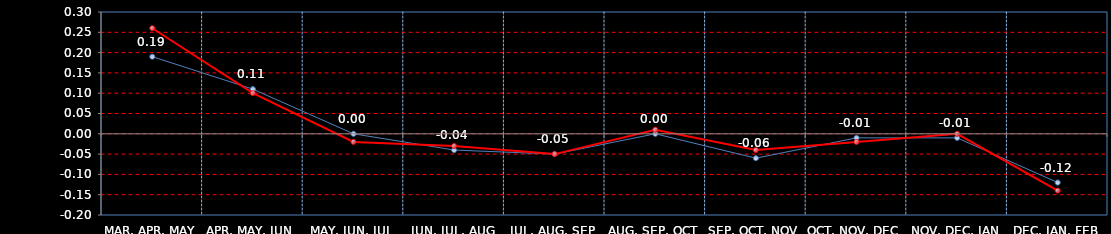
| Category | Last | Settlement |
|---|---|---|
| MAR, APR, MAY | 0.19 | 0.26 |
| APR, MAY, JUN | 0.11 | 0.1 |
| MAY, JUN, JUL | 0 | -0.02 |
| JUN, JUL, AUG | -0.04 | -0.03 |
| JUL, AUG, SEP | -0.05 | -0.05 |
| AUG, SEP, OCT | 0 | 0.01 |
| SEP, OCT, NOV | -0.06 | -0.04 |
| OCT, NOV, DEC | -0.01 | -0.02 |
| NOV, DEC, JAN | -0.01 | 0 |
| DEC, JAN, FEB | -0.12 | -0.14 |